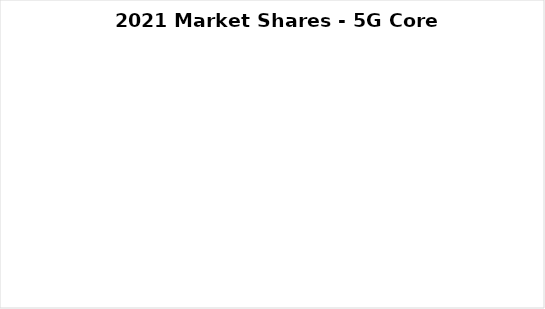
| Category | Series 0 |
|---|---|
| Cisco | 0 |
| Ericsson | 0 |
| Huawei | 0 |
| Mavenir | 0 |
| NEC | 0 |
| Nokia | 0 |
| Samsung | 0 |
| ZTE | 0 |
| Other | 0 |